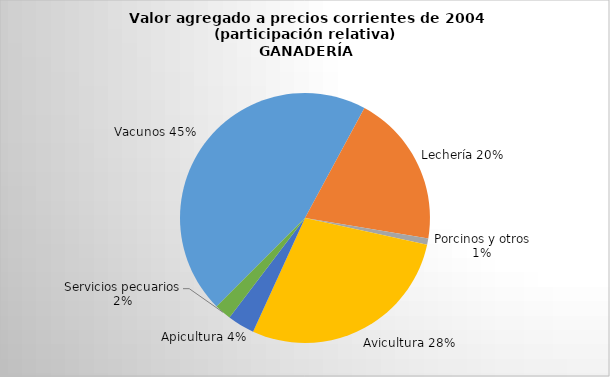
| Category | Series 0 |
|---|---|
| Vacunos | 18.585 |
| Lechería | 8.085 |
| Porcinos y otros | 0.326 |
| Avicultura | 11.629 |
| Apicultura | 1.436 |
| Servicios pecuarios | 0.889 |